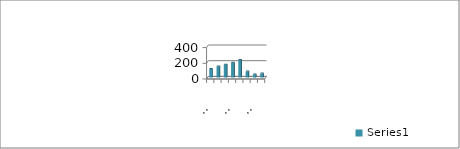
| Category | Series 0 |
|---|---|
| Jūrkalne | 109 |
| Užava | 141 |
| Ventspils | 163 |
| Staldzene | 189 |
| Liepene | 224 |
| Ovīši | 76 |
| Irbes ieteka | 39 |
| Mazirbe | 50 |